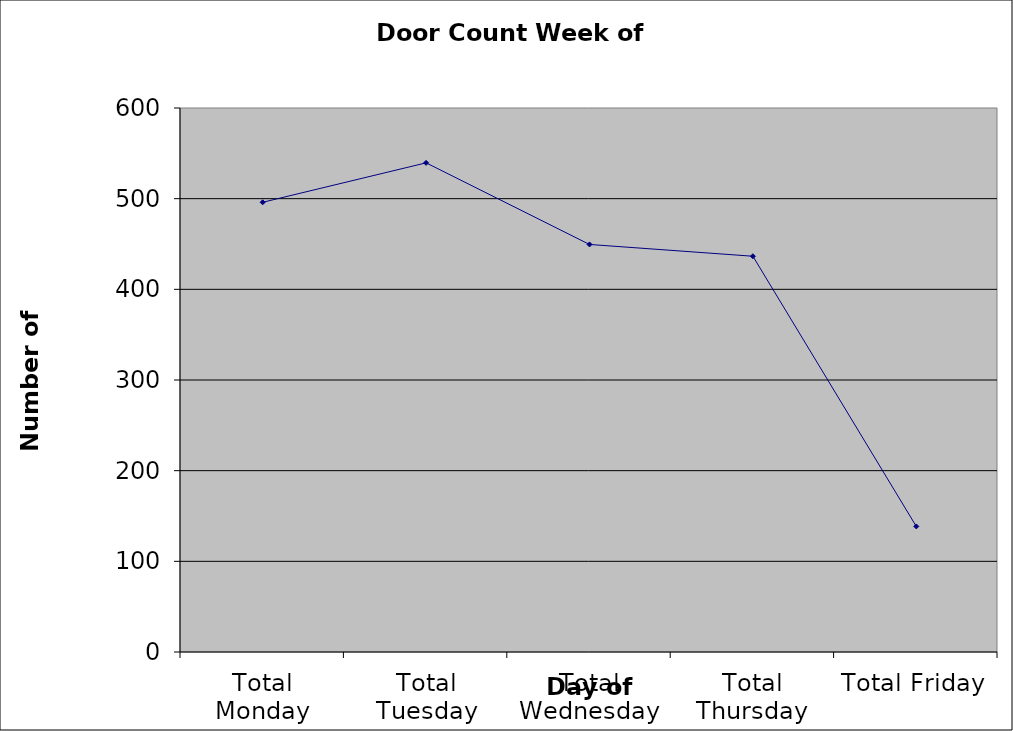
| Category | Series 0 |
|---|---|
| Total Monday | 496 |
| Total Tuesday | 539.5 |
| Total Wednesday | 449.5 |
| Total Thursday | 436.5 |
| Total Friday | 138.5 |